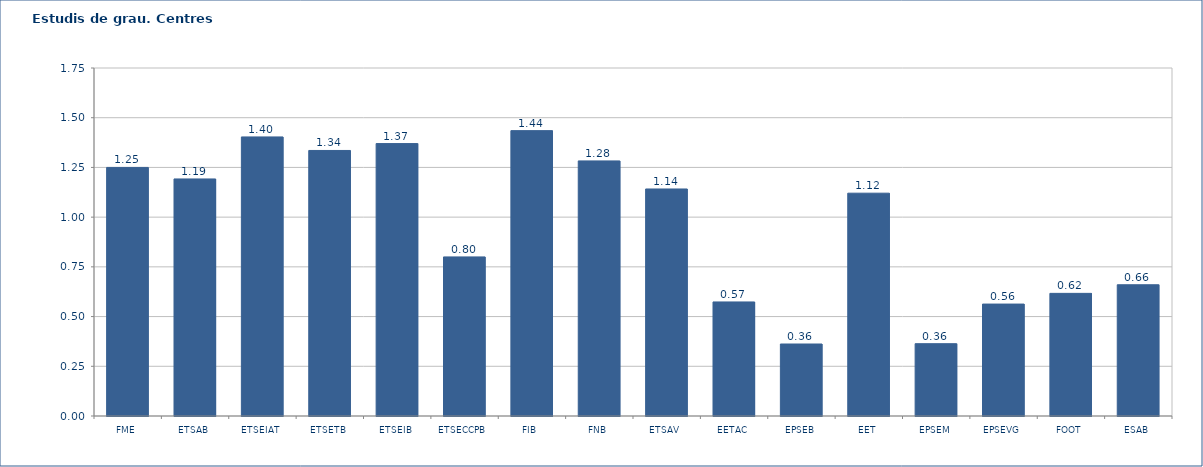
| Category | 2011-12 |
|---|---|
| FME | 1.25 |
| ETSAB | 1.192 |
| ETSEIAT | 1.403 |
| ETSETB | 1.335 |
| ETSEIB | 1.37 |
| ETSECCPB | 0.8 |
| FIB | 1.435 |
| FNB | 1.283 |
| ETSAV | 1.142 |
| EETAC | 0.574 |
| EPSEB | 0.362 |
| EET | 1.121 |
| EPSEM | 0.364 |
| EPSEVG | 0.563 |
| FOOT | 0.617 |
| ESAB | 0.66 |